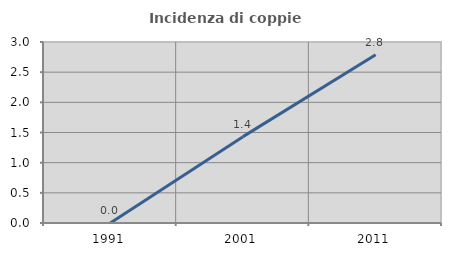
| Category | Incidenza di coppie miste |
|---|---|
| 1991.0 | 0 |
| 2001.0 | 1.431 |
| 2011.0 | 2.79 |